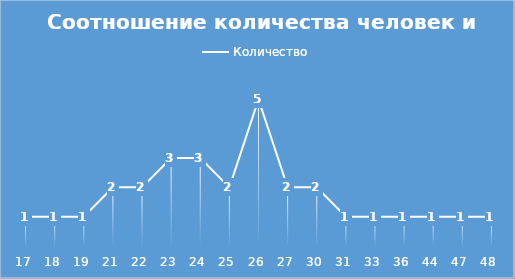
| Category | Количество |
|---|---|
| 17.0 | 1 |
| 18.0 | 1 |
| 19.0 | 1 |
| 21.0 | 2 |
| 22.0 | 2 |
| 23.0 | 3 |
| 24.0 | 3 |
| 25.0 | 2 |
| 26.0 | 5 |
| 27.0 | 2 |
| 30.0 | 2 |
| 31.0 | 1 |
| 33.0 | 1 |
| 36.0 | 1 |
| 44.0 | 1 |
| 47.0 | 1 |
| 48.0 | 1 |